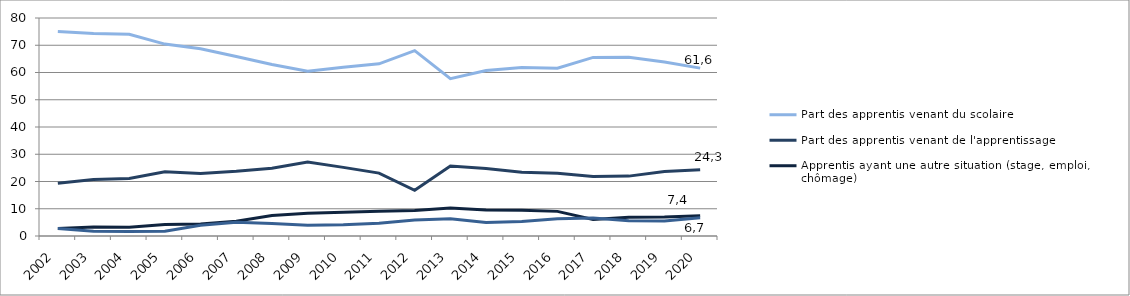
| Category | Part des apprentis venant du scolaire | Part des apprentis venant de l'apprentissage | Apprentis ayant une autre situation (stage, emploi, chômage) | Apprentis ayant une origine inconnue |
|---|---|---|---|---|
| 2002 | 75.061 | 19.393 | 2.777 | 2.77 |
| 2003 | 74.31 | 20.701 | 3.288 | 1.702 |
| 2004 | 74.017 | 21.087 | 3.226 | 1.67 |
| 2005 | 70.429 | 23.593 | 4.234 | 1.744 |
| 2006 | 68.725 | 22.916 | 4.396 | 3.963 |
| 2007 | 65.842 | 23.723 | 5.393 | 5.042 |
| 2008 | 62.965 | 24.896 | 7.556 | 4.584 |
| 2009 | 60.495 | 27.167 | 8.376 | 3.962 |
| 2010 | 61.944 | 25.185 | 8.736 | 4.135 |
| 2011 | 63.171 | 23.089 | 9.081 | 4.66 |
| 2012 | 68.003 | 16.768 | 9.371 | 5.858 |
| 2013 | 57.718 | 25.668 | 10.294 | 6.32 |
| 2014 | 60.697 | 24.751 | 9.587 | 4.965 |
| 2015 | 61.842 | 23.396 | 9.478 | 5.283 |
| 2016 | 61.605 | 23.031 | 9.037 | 6.327 |
| 2017 | 65.548 | 21.841 | 6.037 | 6.575 |
| 2018 | 65.628 | 21.974 | 6.841 | 5.557 |
| 2019 | 63.837 | 23.691 | 6.931 | 5.541 |
| 2020 | 61.6 | 24.3 | 7.4 | 6.7 |